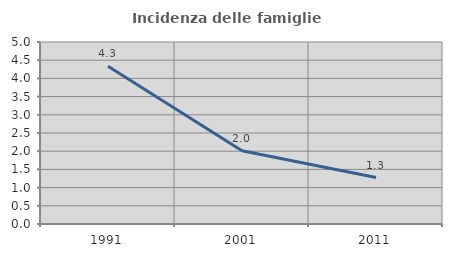
| Category | Incidenza delle famiglie numerose |
|---|---|
| 1991.0 | 4.333 |
| 2001.0 | 2.014 |
| 2011.0 | 1.275 |